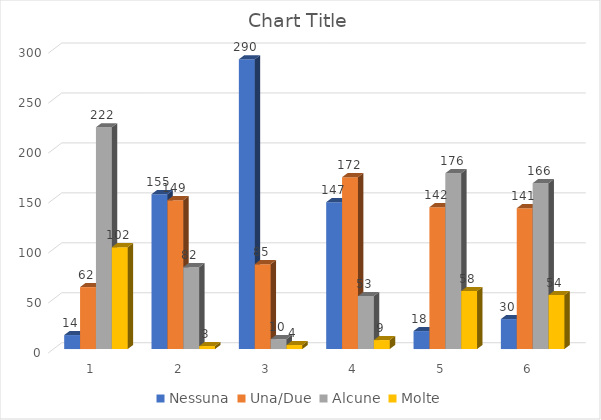
| Category | Nessuna | Una/Due | Alcune | Molte |
|---|---|---|---|---|
| 0 | 14 | 62 | 222 | 102 |
| 1 | 155 | 149 | 82 | 3 |
| 2 | 290 | 85 | 10 | 4 |
| 3 | 147 | 172 | 53 | 9 |
| 4 | 18 | 142 | 176 | 58 |
| 5 | 30 | 141 | 166 | 54 |